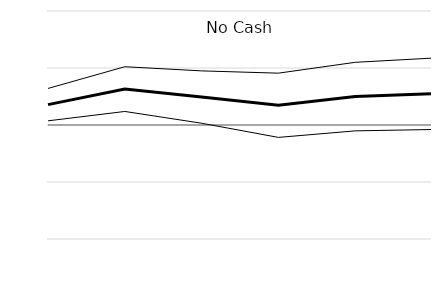
| Category | Series 0 | Series 1 | Series 3 | Series 2 |
|---|---|---|---|---|
| 0.0 | 3.571 | 6.411 | 0 | 0.732 |
| 1.0 | 6.299 | 10.224 | 0 | 2.375 |
| 2.0 | 4.903 | 9.494 | 0 | 0.311 |
| 3.0 | 3.459 | 9.093 | 0 | -2.175 |
| 4.0 | 4.983 | 10.996 | 0 | -1.03 |
| 5.0 | 5.47 | 11.734 | 0 | -0.795 |